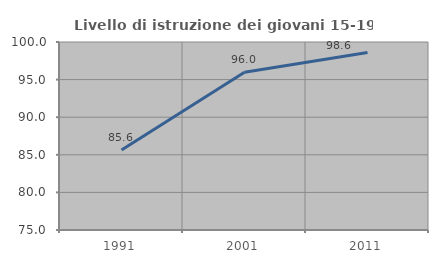
| Category | Livello di istruzione dei giovani 15-19 anni |
|---|---|
| 1991.0 | 85.648 |
| 2001.0 | 95.976 |
| 2011.0 | 98.596 |